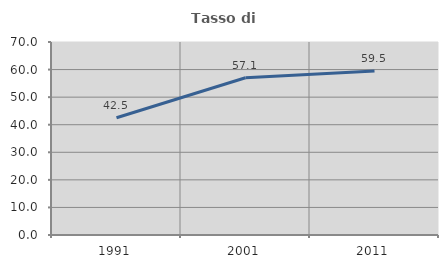
| Category | Tasso di occupazione   |
|---|---|
| 1991.0 | 42.508 |
| 2001.0 | 57.053 |
| 2011.0 | 59.5 |